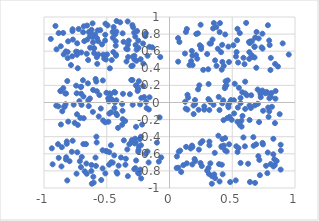
| Category | y |
|---|---|
| 0.4215632161416729 | -0.429 |
| -0.5439717943596771 | -0.906 |
| 0.3300323778906262 | 0.69 |
| -0.1590876969739028 | 0.061 |
| 0.7104913071508583 | 0.749 |
| -0.43871543216138287 | 0.123 |
| -0.47982294965011785 | -0.581 |
| 0.39836657252059515 | -0.088 |
| 0.20513423633886063 | -0.684 |
| 0.4152866277704974 | -0.521 |
| -0.19213584269052864 | 0.775 |
| -0.5025331754925755 | 0.114 |
| -0.8112282229047791 | 0.52 |
| 0.3102317580383367 | 0.04 |
| 0.5892201022421351 | 0.523 |
| -0.532978262706455 | -0.771 |
| 0.7402158925281539 | 0.139 |
| -0.8850489527186902 | -0.046 |
| -0.8682350556055907 | 0.137 |
| 0.442989679152032 | -0.56 |
| 0.36311582794235053 | -0.884 |
| 0.5416659320557835 | 0.861 |
| 0.6335642664545968 | 0.708 |
| 0.45590052118357693 | -0.572 |
| -0.2247557815766017 | 0.053 |
| 0.06833368404740403 | 0.753 |
| 0.7457058993574563 | -0.097 |
| 0.7204414997432471 | -0.85 |
| -0.5053730026492607 | -0.568 |
| 0.1913675752288284 | -0.035 |
| 0.41415828377302266 | -0.512 |
| 0.5891396106603615 | -0.409 |
| -0.9002185324684111 | 0.622 |
| 0.4831128873500843 | -0.93 |
| 0.8060330724895644 | -0.72 |
| -0.42322344116563926 | 0.829 |
| 0.5384611734315119 | 0.728 |
| -0.6472639856049713 | 0.024 |
| -0.29570397664125614 | 0.905 |
| -0.30418539761777885 | -0.468 |
| -0.25758836390502937 | 0.19 |
| -0.45155678975778013 | 0.757 |
| 0.7136372073125965 | -0.229 |
| -0.4884226260602731 | 0.048 |
| -0.4752289872962763 | 0.4 |
| 0.47411927270688925 | 0.473 |
| 0.3850783570652878 | 0.628 |
| -0.202168860181537 | 0.063 |
| -0.6855659259275817 | 0.07 |
| -0.29125356102776623 | 0.536 |
| -0.5825238528475247 | -0.4 |
| 0.31949000548120865 | 0.69 |
| 0.779753509190612 | -0.826 |
| -0.7553189315191842 | -0.239 |
| -0.4406448632484592 | -0.618 |
| -0.23240287060209064 | -0.785 |
| -0.2725038965635511 | -0.768 |
| 0.6936779540315969 | 0.825 |
| 0.637662883438926 | -0.035 |
| -0.6654910613118035 | -0.487 |
| -0.7437997405396619 | 0.197 |
| -0.6070099608527584 | -0.868 |
| -0.5785904848957615 | 0.132 |
| -0.8279201164028627 | -0.021 |
| 0.39494370646423094 | -0.721 |
| 0.7829425011301665 | -0.585 |
| 0.3995258990841366 | 0.823 |
| -0.5835055862881913 | 0.245 |
| 0.5601382053261232 | 0.812 |
| -0.5122861384701802 | 0.792 |
| -0.8143588467749583 | 0.251 |
| -0.610351800713917 | -0.11 |
| -0.8685305043429283 | 0.132 |
| -0.23000042931859044 | 0.507 |
| -0.4643794335092375 | -0.699 |
| -0.7722398542158302 | 0.857 |
| 0.3895286905249995 | -0.388 |
| -0.6499300947662705 | 0.224 |
| 0.7157249633114966 | -0.672 |
| -0.3775374568130394 | -0.261 |
| -0.25811117029873976 | 0.836 |
| 0.6381064481422742 | -0.205 |
| -0.30031964705997405 | -0.441 |
| 0.37303283168498313 | 0.881 |
| -0.27438120458757753 | -0.423 |
| -0.7715600601145918 | -0.448 |
| 0.4744729587542802 | -0.01 |
| 0.36350524933164596 | 0.493 |
| 0.7040487930708936 | -0.015 |
| -0.4758966110652365 | 0.106 |
| -0.6290897088089664 | 0.816 |
| 0.838787820102117 | -0.732 |
| 0.6107228899158967 | 0.931 |
| -0.6211565328097148 | 0.851 |
| -0.4182601711201941 | -0.147 |
| 0.7268491274804818 | 0.061 |
| 0.5421347985424121 | -0.578 |
| -0.659594359102081 | -0.833 |
| 0.12523591845327364 | 0.009 |
| -0.8463220907614202 | 0.168 |
| -0.6790862485366014 | 0.718 |
| 0.12330026480179512 | 0.573 |
| 0.7253453461686394 | 0.096 |
| 0.2520123258673048 | 0.627 |
| 0.5325953105023653 | -0.512 |
| -0.8115010236217801 | 0.591 |
| -0.4100523147374533 | -0.297 |
| 0.411234320403453 | 0.589 |
| -0.3360904225080985 | -0.549 |
| -0.17562531127970415 | -0.573 |
| 0.635990929126655 | 0.589 |
| -0.710713737317455 | -0.18 |
| 0.5597459299342631 | -0.261 |
| -0.5312827376828946 | 0.258 |
| 0.2572662925546334 | -0.743 |
| 0.1483438277884226 | 0.056 |
| -0.7731544621127802 | 0.835 |
| -0.5067265243450461 | 0.503 |
| -0.2539710843650542 | 0.135 |
| 0.44399554083910475 | 0.796 |
| 0.8440245474675019 | 0.045 |
| 0.06893905326317373 | 0.478 |
| -0.7042025267749765 | 0.103 |
| 0.4306311460221839 | -0.206 |
| 0.42069868330201565 | -0.01 |
| -0.8261970057876937 | 0.598 |
| 0.7957173812265206 | 0.049 |
| 0.4530837347954577 | 0.202 |
| -0.3864462285146437 | -0.643 |
| 0.7444452156572638 | -0.49 |
| 0.6400066043362731 | 0.695 |
| -0.248772867126831 | -0.576 |
| 0.21332608687080779 | 0.802 |
| 0.733605248353018 | 0.645 |
| -0.28129810568541114 | 0.818 |
| -0.42151280046918926 | 0.953 |
| 0.8857227112013295 | -0.785 |
| 0.12903936520595183 | -0.072 |
| -0.3340644687936267 | 0.623 |
| 0.741335123388569 | -0.472 |
| 0.7943531604745473 | 0.725 |
| 0.35687049507637436 | -0.841 |
| 0.8124464349948495 | 0.111 |
| 0.44316053820730517 | -0.417 |
| 0.4210602766882474 | 0.475 |
| -0.599939652388557 | 0.635 |
| 0.680432538796766 | -0.034 |
| -0.3661343953071188 | 0.709 |
| 0.8271021575080473 | -0.606 |
| -0.3512462802722489 | -0.728 |
| -0.42143093718626634 | -0.814 |
| -0.4474851254590646 | 0.59 |
| -0.6229798222334648 | -0.801 |
| -0.32018438011070094 | -0.488 |
| -0.2631127157937121 | 0.488 |
| -0.42622909720237256 | 0.559 |
| -0.5285778268276176 | -0.21 |
| 0.6510933805813921 | 0.085 |
| 0.7025566621963641 | 0.152 |
| -0.5377285070019082 | 0.68 |
| 0.6826313152642043 | 0.759 |
| 0.18248036265679013 | 0.549 |
| -0.3744032075026176 | -0.096 |
| 0.6535066504848386 | 0.554 |
| 0.22094557456802844 | 0.512 |
| 0.7403067539540609 | 0.805 |
| -0.6216235700505823 | -0.73 |
| -0.3476336034037819 | -0.658 |
| -0.22568769480946815 | -0.888 |
| 0.35053361950036277 | -0.027 |
| 0.7737522536506181 | 0.124 |
| -0.8254350032027895 | -0.667 |
| 0.2627148642800863 | -0.452 |
| 0.2769313851077846 | -0.045 |
| -0.5770568719537237 | 0.752 |
| 0.6564184748351949 | 0.716 |
| -0.8663379224260075 | 0.658 |
| -0.6988645264605184 | -0.637 |
| 0.24792805007460483 | 0.909 |
| -0.4936421413951495 | 0.902 |
| -0.7055634481858182 | -0.756 |
| -0.7008032746370427 | -0.027 |
| -0.5282600411024905 | 0.559 |
| -0.7965371241533912 | -0.687 |
| 0.24709140409000296 | -0.708 |
| -0.6836084726912428 | -0.184 |
| -0.2954439631920538 | 0.263 |
| -0.7033205673171459 | 0.184 |
| -0.4390431063906586 | -0.065 |
| 0.30026160418708936 | -0.797 |
| 0.7080694928928828 | -0.628 |
| 0.11004561046709194 | -0.733 |
| 0.07370626706264316 | -0.575 |
| -0.4343268991758056 | 0.002 |
| 0.4611177203914638 | -0.182 |
| 0.8404624008724482 | -0.241 |
| -0.6087232592611971 | 0.147 |
| -0.269252734381463 | -0.467 |
| 0.1687914589211852 | -0.538 |
| 0.1310867615477247 | 0.825 |
| 0.8276786150566307 | -0.424 |
| -0.9456977374248519 | 0.743 |
| -0.8363183357062245 | -0.048 |
| -0.32470972546328647 | 0.723 |
| -0.532995763201443 | -0.559 |
| 0.17782348571137496 | 0.603 |
| -0.24356288628773215 | -0.517 |
| 0.9018429151019882 | 0.691 |
| -0.656751453505285 | 0.9 |
| 0.19246413272113938 | -0.135 |
| 0.32369035557087567 | 0.007 |
| 0.37493310757649545 | 0.429 |
| -0.5791835163764185 | 0.53 |
| -0.5110879178851448 | -0.829 |
| 0.319017641038452 | 0.023 |
| -0.56653982828972 | 0.561 |
| -0.2932328773095336 | -0.026 |
| 0.25256231545013086 | 0.652 |
| 0.4692546163470157 | 0.653 |
| 0.2341689581313473 | -0.551 |
| -0.6895373170923309 | 0.26 |
| -0.26219898520223306 | 0.617 |
| 0.5465670441356256 | 0.468 |
| -0.7239256798802061 | 0.86 |
| -0.42681959094468414 | -0.127 |
| -0.42835193118936754 | 0.716 |
| -0.24685422692119263 | -0.555 |
| 0.4456499217648173 | 0.19 |
| -0.7370602572018783 | -0.138 |
| 0.5447185951609801 | -0.059 |
| 0.300182828150132 | 0.567 |
| -0.7304863527857448 | -0.262 |
| 0.670200205139891 | -0.506 |
| 0.46821832280596043 | -0.034 |
| 0.5136175375217122 | 0.026 |
| 0.8071923888453094 | 0.065 |
| -0.7182165692485973 | 0.016 |
| 0.8536559461448536 | -0.684 |
| 0.5344574847756505 | 0.59 |
| 0.6917952232066484 | 0.406 |
| -0.3535609146663352 | -0.217 |
| -0.5894205923449152 | -0.644 |
| 0.31077493823528024 | -0.766 |
| -0.6625456428294167 | -0.714 |
| 0.3180385688321985 | -0.458 |
| -0.4722878317251027 | 0.093 |
| 0.7631740351498044 | 0.108 |
| -0.3332646442176699 | 0.948 |
| 0.18393180541646204 | 0.437 |
| -0.8544723560000491 | -0.103 |
| 0.5147092102653734 | -0.128 |
| -0.33068099471624524 | 0.677 |
| -0.37059223651038886 | 0.101 |
| 0.6413296144131218 | -0.93 |
| -0.8883548815207369 | -0.488 |
| 0.5196400133268424 | 0.219 |
| -0.8607831458277997 | -0.748 |
| -0.28968393793181946 | 0.879 |
| -0.23517646676358295 | -0.427 |
| -0.882906041036795 | 0.812 |
| 0.8072738630366749 | 0.522 |
| -0.1380010019605824 | 0.645 |
| 0.22783702094825542 | 0.154 |
| 0.4895797984116248 | 0.028 |
| -0.45284235879103796 | 0.825 |
| 0.5976457948516394 | 0.448 |
| -0.8184561556870629 | -0.456 |
| -0.632421224344391 | 0.777 |
| -0.8145853728581398 | -0.912 |
| -0.6341775226841786 | 0.047 |
| -0.5803966346604619 | -0.468 |
| -0.5685123825561318 | 0.716 |
| -0.8827239185946543 | -0.648 |
| 0.8868480734294852 | -0.562 |
| 0.42345049985577576 | -0.839 |
| 0.5795931753529089 | 0.12 |
| -0.372768058721747 | -0.195 |
| -0.2805826439790895 | -0.779 |
| -0.2338519401274528 | -0.022 |
| 0.6773202693433609 | 0.65 |
| -0.865250838628475 | -0.257 |
| 0.8042179220886296 | 0.38 |
| -0.714409244464058 | -0.686 |
| -0.6480343339409693 | 0.497 |
| -0.7405689941918363 | -0.833 |
| 0.877857325144515 | -0.136 |
| -0.25019642370098283 | -0.824 |
| -0.42666903842544546 | 0.547 |
| 0.07032082381126381 | -0.763 |
| -0.6130284915872011 | 0.765 |
| -0.9312565088276643 | -0.723 |
| -0.2442261457882835 | 0.25 |
| 0.7830395908315471 | 0.113 |
| 0.17252780411064572 | 0.484 |
| -0.8472356629853401 | 0.814 |
| 0.21115144092534077 | 0.555 |
| -0.6092526486210961 | 0.704 |
| -0.8080458043759786 | 0.716 |
| -0.8186547594395146 | -0.483 |
| -0.8383607844371901 | -0.05 |
| -0.2702130198514938 | 0.672 |
| 0.08511999816266691 | -0.563 |
| -0.4808424837412104 | -0.727 |
| 0.3535290710563146 | 0.93 |
| 0.23773114157031472 | 0.201 |
| -0.37780215039836973 | -0.017 |
| 0.41591311543536413 | 0.384 |
| -0.06575464725494529 | -0.643 |
| -0.6592377103740725 | 0.569 |
| 0.7894372440634161 | -0.168 |
| 0.6353229819211244 | 0.51 |
| -0.26789888215858393 | 0.201 |
| 0.43216900604508846 | 0.428 |
| -0.4156373084418423 | -0.832 |
| 0.19976821798600453 | -0.661 |
| -0.6865048169340213 | -0.486 |
| -0.49828060101072813 | -0.572 |
| -0.2935310196123351 | 0.431 |
| -0.21057817199219753 | 0.192 |
| -0.8306312314712987 | 0.107 |
| 0.47006505344949145 | -0.056 |
| -0.1898803578522612 | -0.601 |
| -0.2727858080790935 | 0.771 |
| 0.41985537329576084 | 0.675 |
| -0.27964715000375584 | 0.546 |
| 0.15917397942788925 | 0.438 |
| -0.6045277141205627 | 0.634 |
| -0.7396032770726106 | 0.108 |
| -0.5121914859892485 | -0.231 |
| -0.2183002099212772 | -0.258 |
| 0.690676951491078 | -0.489 |
| 0.3921600614383831 | 0.065 |
| -0.466023585921556 | -0.115 |
| -0.47965086108695254 | -0.13 |
| 0.23181027786179076 | -0.085 |
| 0.5814409588290408 | -0.157 |
| -0.3636003299736983 | -0.443 |
| -0.5927859341758095 | 0.795 |
| 0.31809582304456674 | -0.501 |
| -0.18666012583896463 | 0.007 |
| 0.056991111958482055 | -0.766 |
| 0.6008911895156663 | -0.513 |
| 0.7841563382209884 | 0.904 |
| -0.22742475546631047 | -0.4 |
| 0.5498552761603308 | -0.534 |
| -0.7850831228536983 | 0.438 |
| 0.1430928997624068 | -0.083 |
| -0.16036496410186096 | 0.652 |
| 0.6483753538685924 | -0.064 |
| 0.6817100978592769 | -0.94 |
| 0.24798190786128127 | -0.475 |
| 0.3989848488320449 | -0.924 |
| 0.09304455606082818 | -0.813 |
| -0.3034550069384494 | 0.425 |
| 0.4331258206266859 | -0.504 |
| 0.6778056630657827 | 0.527 |
| 0.4953681814489779 | -0.203 |
| 0.1381756841128774 | 0.859 |
| -0.0735839176007913 | 0.532 |
| -0.08507610626461148 | -0.691 |
| 0.828171542300409 | -0.748 |
| -0.5474063643661125 | -0.07 |
| -0.17474996040078206 | 0.547 |
| -0.706914856950039 | 0.182 |
| 0.8414949993009562 | 0.451 |
| -0.8230311991943204 | -0.641 |
| 0.4021850471923991 | 0.929 |
| 0.7691368730020831 | -0.74 |
| -0.6424286591969968 | 0.824 |
| -0.2657389830684489 | -0.678 |
| -0.24870958957087197 | 0.723 |
| -0.20824186491712093 | 0.455 |
| -0.5132704067464904 | 0.725 |
| -0.5860040617096662 | -0.742 |
| -0.8242350238258949 | 0.104 |
| -0.5103573543005819 | 0.922 |
| -0.45253173790097145 | -0.703 |
| -0.3426236065365156 | 0.48 |
| 0.3370252537531291 | -0.859 |
| -0.4451862409925029 | 0.883 |
| -0.6129658120634411 | 0.925 |
| 0.5747287237670491 | -0.283 |
| 0.2687000271205422 | 0.382 |
| -0.33176343482076587 | -0.861 |
| 0.13226463480948736 | -0.519 |
| -0.6882098268222263 | 0.823 |
| -0.6323454069879308 | 0.641 |
| -0.4285268241049591 | 0.665 |
| -0.6542348262403794 | 0.737 |
| -0.43313142532091553 | 0.116 |
| -0.2505098461490938 | 0.158 |
| -0.5757254770006133 | 0.452 |
| -0.4601819432185166 | 0.496 |
| -0.39297457624816845 | 0.938 |
| -0.48693012476668485 | -0.225 |
| 0.34283088897640823 | 0.736 |
| -0.7442476172832129 | 0.595 |
| -0.2767689645440641 | -0.479 |
| -0.24305883532828276 | -0.833 |
| -0.7371589725438517 | 0.558 |
| 0.3473677385806033 | 0.866 |
| 0.47518946863086464 | -0.489 |
| 0.07901411918315904 | 0.708 |
| 0.31372704154092723 | -0.834 |
| -0.735328036404062 | 0.692 |
| 0.7981109326963074 | 0.672 |
| -0.16450488959360143 | -0.082 |
| -0.466734146545285 | -0.5 |
| -0.8070126844324343 | -0.223 |
| -0.1004456712435211 | -0.47 |
| -0.4055392241946665 | -0.739 |
| -0.32938758695475623 | 0.532 |
| 0.6780057335978424 | 0.655 |
| -0.8431461960090667 | 0.563 |
| 0.24160397004835987 | 0.67 |
| -0.5516185463217727 | 0.846 |
| -0.5888770867397646 | 0.275 |
| -0.34463442261469224 | 0.629 |
| 0.2031663596101756 | 0.029 |
| 0.7211733019601347 | 0.127 |
| 0.181964200258929 | -0.725 |
| -0.7028051712925052 | 0.585 |
| 0.33734127404053527 | -0.95 |
| -0.6434019819248413 | -0.042 |
| -0.8577444918758732 | -0.523 |
| 0.32541040212094186 | -0.711 |
| -0.9024392456210792 | -0.037 |
| -0.7343560542264591 | -0.582 |
| -0.4828049835788115 | 0.014 |
| 0.8162762545292834 | -0.05 |
| -0.21058986272538616 | 0.69 |
| -0.42342983698820746 | 0.026 |
| 0.527730556474703 | -0.911 |
| 0.6680234032413797 | -0.406 |
| 0.4469388016818143 | 0.249 |
| 0.46393111992978886 | 0.259 |
| 0.6030394599073847 | 0.243 |
| -0.1819866719913854 | -0.065 |
| 0.5093225380982025 | 0.67 |
| 0.885858847978835 | -0.494 |
| -0.1887105821584869 | 0.81 |
| 0.7864425531848769 | -0.059 |
| -0.5204271010447348 | 0.514 |
| 0.1830732211169539 | -0.52 |
| 0.5663319703843583 | 0.053 |
| 0.5412716868617464 | -0.225 |
| 0.5664243303396641 | -0.008 |
| 0.31157184882306543 | 0.216 |
| 0.44106349850462245 | 0.168 |
| -0.30466351981733264 | 0.263 |
| -0.6754515285957152 | -0.805 |
| -0.16631880378113517 | -0.702 |
| 0.6031070984247058 | -0.075 |
| 0.47878120062690566 | -0.167 |
| 0.6444957112142331 | 0.714 |
| -0.5724154968493587 | 0.843 |
| -0.5587680855494088 | 0.087 |
| -0.9088513589840859 | 0.895 |
| 0.5295808981327044 | 0.538 |
| 0.9502985235529757 | 0.561 |
| 0.7946512496527138 | -0.103 |
| 0.5665744823627503 | -0.707 |
| -0.28015238104551843 | 0.505 |
| -0.6187972904733909 | -0.95 |
| -0.3736124551862692 | 0.809 |
| -0.43202073753062753 | 0.798 |
| 0.2262668347186665 | 0.809 |
| 0.17934667158273743 | -0.504 |
| 0.6261541040538825 | -0.716 |
| -0.7783144611059136 | -0.576 |
| -0.6000925973632996 | 0.577 |
| 0.5529375175974007 | 0.172 |
| -0.24703963258087103 | 0.639 |
| -0.9376391033812457 | -0.536 |
| -0.563845762443612 | -0.163 |
| -0.7330582628914613 | 0.591 |
| -0.31554839722367634 | 0.097 |
| 0.6642118697117982 | 0.533 |
| -0.6041896501878234 | -0.937 |
| 0.36061917780635966 | -0.589 |
| -0.7698902889101118 | 0.736 |
| 0.14330007663119604 | 0.09 |
| 0.8453226560131051 | 0.134 |
| 0.8353397357849586 | -0.663 |
| -0.2665837326433733 | -0.284 |
| 0.4168841534328531 | -0.728 |
| -0.6830304132659226 | 0.891 |
| 0.30831322678338613 | 0.388 |
| -0.2274783477944533 | -0.5 |
| -0.7749356735209156 | 0.541 |
| 0.2769417634800464 | -0.084 |
| 0.8642849216001154 | 0.421 |
| -0.46085710460876794 | 0.038 |
| 0.13766099698874035 | -0.712 |
| -0.07880612024254052 | -0.174 |
| -0.7636305816940829 | -0.025 |
| 0.6169022221851306 | 0.085 |
| 0.42814094212827447 | 0.026 |
| 0.5729232520023539 | -0.213 |
| 0.7415642450959254 | 0.631 |
| 0.2039372552227121 | -0.017 |
| -0.7309517545512121 | 0.401 |
| 0.3170086832558092 | -0.087 |
| -0.4974457285192051 | 0.562 |
| 0.058982934223793304 | -0.631 |
| 0.6034533298475402 | 0.106 |